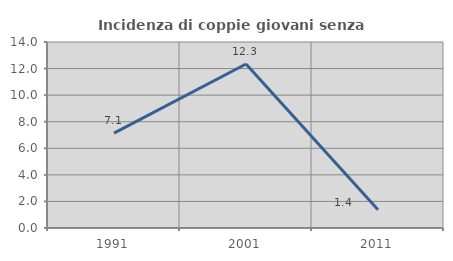
| Category | Incidenza di coppie giovani senza figli |
|---|---|
| 1991.0 | 7.143 |
| 2001.0 | 12.346 |
| 2011.0 | 1.37 |